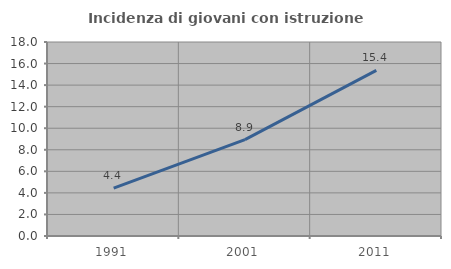
| Category | Incidenza di giovani con istruzione universitaria |
|---|---|
| 1991.0 | 4.437 |
| 2001.0 | 8.943 |
| 2011.0 | 15.361 |